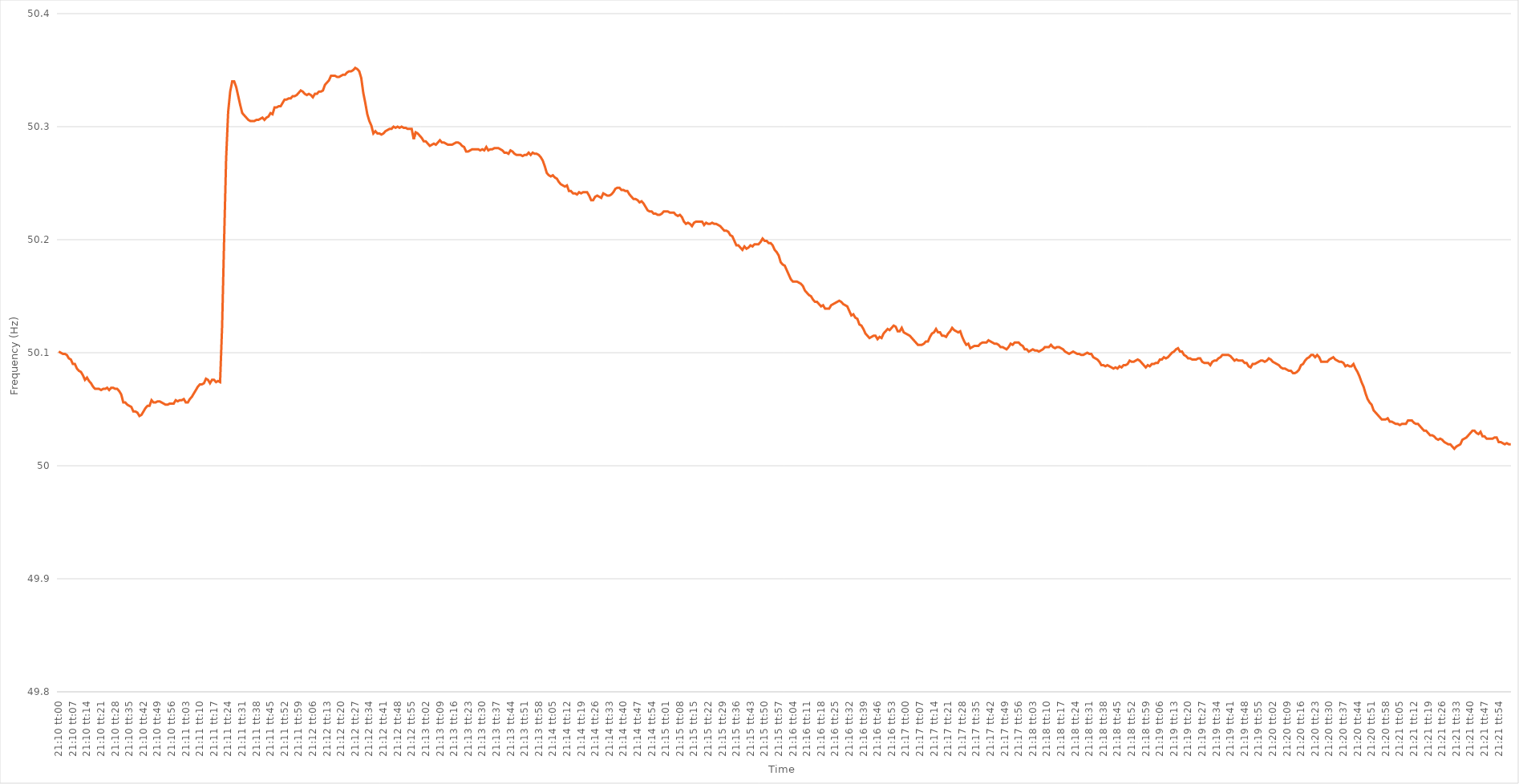
| Category | Series 0 |
|---|---|
| 0.8819444444444445 | 50.101 |
| 0.8819560185185185 | 50.1 |
| 0.8819675925925926 | 50.099 |
| 0.8819791666666666 | 50.099 |
| 0.8819907407407408 | 50.098 |
| 0.8820023148148147 | 50.095 |
| 0.8820138888888889 | 50.094 |
| 0.882025462962963 | 50.09 |
| 0.8820370370370371 | 50.09 |
| 0.8820486111111111 | 50.086 |
| 0.8820601851851851 | 50.084 |
| 0.8820717592592593 | 50.083 |
| 0.8820833333333334 | 50.08 |
| 0.8820949074074074 | 50.076 |
| 0.8821064814814815 | 50.078 |
| 0.8821180555555556 | 50.075 |
| 0.8821296296296296 | 50.073 |
| 0.8821412037037036 | 50.07 |
| 0.8821527777777778 | 50.068 |
| 0.8821643518518519 | 50.068 |
| 0.8821759259259259 | 50.068 |
| 0.8821875 | 50.067 |
| 0.882199074074074 | 50.068 |
| 0.8822106481481482 | 50.068 |
| 0.8822222222222221 | 50.069 |
| 0.8822337962962963 | 50.067 |
| 0.8822453703703704 | 50.069 |
| 0.8822569444444445 | 50.069 |
| 0.8822685185185185 | 50.068 |
| 0.8822800925925925 | 50.068 |
| 0.8822916666666667 | 50.066 |
| 0.8823032407407408 | 50.063 |
| 0.8823148148148148 | 50.056 |
| 0.8823263888888889 | 50.056 |
| 0.882337962962963 | 50.054 |
| 0.882349537037037 | 50.053 |
| 0.882361111111111 | 50.052 |
| 0.8823726851851852 | 50.048 |
| 0.8823842592592593 | 50.048 |
| 0.8823958333333333 | 50.047 |
| 0.8824074074074074 | 50.044 |
| 0.8824189814814815 | 50.045 |
| 0.8824305555555556 | 50.048 |
| 0.8824421296296295 | 50.051 |
| 0.8824537037037037 | 50.053 |
| 0.8824652777777778 | 50.053 |
| 0.8824768518518519 | 50.058 |
| 0.8824884259259259 | 50.056 |
| 0.8825 | 50.056 |
| 0.8825115740740741 | 50.057 |
| 0.8825231481481483 | 50.057 |
| 0.8825347222222222 | 50.056 |
| 0.8825462962962963 | 50.055 |
| 0.8825578703703704 | 50.054 |
| 0.8825694444444445 | 50.054 |
| 0.8825810185185184 | 50.055 |
| 0.8825925925925926 | 50.055 |
| 0.8826041666666667 | 50.055 |
| 0.8826157407407407 | 50.058 |
| 0.8826273148148148 | 50.057 |
| 0.8826388888888889 | 50.058 |
| 0.882650462962963 | 50.058 |
| 0.8826620370370369 | 50.059 |
| 0.8826736111111111 | 50.056 |
| 0.8826851851851852 | 50.056 |
| 0.8826967592592593 | 50.059 |
| 0.8827083333333333 | 50.061 |
| 0.8827199074074074 | 50.064 |
| 0.8827314814814815 | 50.067 |
| 0.8827430555555557 | 50.07 |
| 0.8827546296296296 | 50.072 |
| 0.8827662037037037 | 50.072 |
| 0.8827777777777778 | 50.073 |
| 0.8827893518518519 | 50.077 |
| 0.8828009259259259 | 50.076 |
| 0.8828125 | 50.073 |
| 0.8828240740740741 | 50.076 |
| 0.8828356481481481 | 50.076 |
| 0.8828472222222222 | 50.074 |
| 0.8828587962962963 | 50.075 |
| 0.8828703703703704 | 50.074 |
| 0.8828819444444443 | 50.123 |
| 0.8828935185185185 | 50.2 |
| 0.8829050925925926 | 50.272 |
| 0.8829166666666667 | 50.313 |
| 0.8829282407407407 | 50.331 |
| 0.8829398148148148 | 50.34 |
| 0.8829513888888889 | 50.34 |
| 0.8829629629629631 | 50.335 |
| 0.882974537037037 | 50.327 |
| 0.8829861111111111 | 50.319 |
| 0.8829976851851852 | 50.312 |
| 0.8830092592592593 | 50.31 |
| 0.8830208333333333 | 50.308 |
| 0.8830324074074074 | 50.306 |
| 0.8830439814814816 | 50.305 |
| 0.8830555555555555 | 50.305 |
| 0.8830671296296296 | 50.305 |
| 0.8830787037037037 | 50.306 |
| 0.8830902777777778 | 50.306 |
| 0.8831018518518517 | 50.307 |
| 0.8831134259259259 | 50.308 |
| 0.883125 | 50.306 |
| 0.8831365740740741 | 50.308 |
| 0.8831481481481481 | 50.309 |
| 0.8831597222222222 | 50.312 |
| 0.8831712962962963 | 50.311 |
| 0.8831828703703705 | 50.317 |
| 0.8831944444444444 | 50.317 |
| 0.8832060185185185 | 50.318 |
| 0.8832175925925926 | 50.318 |
| 0.8832291666666667 | 50.321 |
| 0.8832407407407407 | 50.324 |
| 0.8832523148148148 | 50.324 |
| 0.883263888888889 | 50.325 |
| 0.883275462962963 | 50.325 |
| 0.883287037037037 | 50.327 |
| 0.8832986111111111 | 50.327 |
| 0.8833101851851852 | 50.328 |
| 0.8833217592592592 | 50.33 |
| 0.8833333333333333 | 50.332 |
| 0.8833449074074075 | 50.331 |
| 0.8833564814814815 | 50.329 |
| 0.8833680555555555 | 50.328 |
| 0.8833796296296296 | 50.329 |
| 0.8833912037037037 | 50.328 |
| 0.8834027777777779 | 50.326 |
| 0.8834143518518518 | 50.329 |
| 0.883425925925926 | 50.329 |
| 0.8834375 | 50.331 |
| 0.8834490740740741 | 50.331 |
| 0.8834606481481481 | 50.332 |
| 0.8834722222222222 | 50.337 |
| 0.8834837962962964 | 50.339 |
| 0.8834953703703704 | 50.341 |
| 0.8835069444444444 | 50.345 |
| 0.8835185185185185 | 50.345 |
| 0.8835300925925926 | 50.345 |
| 0.8835416666666666 | 50.344 |
| 0.8835532407407407 | 50.344 |
| 0.8835648148148149 | 50.345 |
| 0.8835763888888889 | 50.346 |
| 0.8835879629629629 | 50.346 |
| 0.883599537037037 | 50.348 |
| 0.8836111111111111 | 50.349 |
| 0.8836226851851853 | 50.349 |
| 0.8836342592592592 | 50.35 |
| 0.8836458333333334 | 50.352 |
| 0.8836574074074074 | 50.351 |
| 0.8836689814814815 | 50.349 |
| 0.8836805555555555 | 50.343 |
| 0.8836921296296296 | 50.33 |
| 0.8837037037037038 | 50.321 |
| 0.8837152777777778 | 50.311 |
| 0.8837268518518518 | 50.305 |
| 0.8837384259259259 | 50.301 |
| 0.88375 | 50.294 |
| 0.883761574074074 | 50.296 |
| 0.8837731481481481 | 50.294 |
| 0.8837847222222223 | 50.294 |
| 0.8837962962962963 | 50.293 |
| 0.8838078703703703 | 50.294 |
| 0.8838194444444444 | 50.296 |
| 0.8838310185185185 | 50.297 |
| 0.8838425925925927 | 50.298 |
| 0.8838541666666666 | 50.298 |
| 0.8838657407407408 | 50.3 |
| 0.8838773148148148 | 50.299 |
| 0.883888888888889 | 50.3 |
| 0.8839004629629629 | 50.299 |
| 0.883912037037037 | 50.3 |
| 0.8839236111111112 | 50.299 |
| 0.8839351851851852 | 50.299 |
| 0.8839467592592593 | 50.298 |
| 0.8839583333333333 | 50.298 |
| 0.8839699074074074 | 50.298 |
| 0.8839814814814816 | 50.289 |
| 0.8839930555555555 | 50.295 |
| 0.8840046296296297 | 50.294 |
| 0.8840162037037037 | 50.292 |
| 0.8840277777777777 | 50.29 |
| 0.8840393518518518 | 50.287 |
| 0.8840509259259259 | 50.287 |
| 0.8840625000000001 | 50.285 |
| 0.884074074074074 | 50.283 |
| 0.8840856481481482 | 50.284 |
| 0.8840972222222222 | 50.285 |
| 0.8841087962962964 | 50.284 |
| 0.8841203703703703 | 50.286 |
| 0.8841319444444444 | 50.288 |
| 0.8841435185185186 | 50.286 |
| 0.8841550925925926 | 50.286 |
| 0.8841666666666667 | 50.285 |
| 0.8841782407407407 | 50.284 |
| 0.8841898148148148 | 50.284 |
| 0.884201388888889 | 50.284 |
| 0.8842129629629629 | 50.285 |
| 0.8842245370370371 | 50.286 |
| 0.8842361111111111 | 50.286 |
| 0.8842476851851852 | 50.285 |
| 0.8842592592592592 | 50.283 |
| 0.8842708333333333 | 50.282 |
| 0.8842824074074075 | 50.278 |
| 0.8842939814814814 | 50.278 |
| 0.8843055555555556 | 50.279 |
| 0.8843171296296296 | 50.28 |
| 0.8843287037037038 | 50.28 |
| 0.8843402777777777 | 50.28 |
| 0.8843518518518518 | 50.28 |
| 0.884363425925926 | 50.279 |
| 0.884375 | 50.28 |
| 0.8843865740740741 | 50.279 |
| 0.8843981481481481 | 50.282 |
| 0.8844097222222222 | 50.279 |
| 0.8844212962962964 | 50.28 |
| 0.8844328703703703 | 50.28 |
| 0.8844444444444445 | 50.281 |
| 0.8844560185185185 | 50.281 |
| 0.8844675925925927 | 50.281 |
| 0.8844791666666666 | 50.28 |
| 0.8844907407407407 | 50.279 |
| 0.8845023148148149 | 50.277 |
| 0.8845138888888888 | 50.277 |
| 0.884525462962963 | 50.276 |
| 0.884537037037037 | 50.279 |
| 0.8845486111111112 | 50.278 |
| 0.8845601851851851 | 50.276 |
| 0.8845717592592592 | 50.275 |
| 0.8845833333333334 | 50.275 |
| 0.8845949074074074 | 50.275 |
| 0.8846064814814815 | 50.274 |
| 0.8846180555555555 | 50.275 |
| 0.8846296296296297 | 50.275 |
| 0.8846412037037038 | 50.277 |
| 0.8846527777777777 | 50.275 |
| 0.8846643518518519 | 50.277 |
| 0.8846759259259259 | 50.276 |
| 0.8846875000000001 | 50.276 |
| 0.884699074074074 | 50.275 |
| 0.8847106481481481 | 50.273 |
| 0.8847222222222223 | 50.27 |
| 0.8847337962962962 | 50.265 |
| 0.8847453703703704 | 50.259 |
| 0.8847569444444444 | 50.257 |
| 0.8847685185185186 | 50.256 |
| 0.8847800925925925 | 50.257 |
| 0.8847916666666666 | 50.255 |
| 0.8848032407407408 | 50.254 |
| 0.8848148148148148 | 50.251 |
| 0.8848263888888889 | 50.249 |
| 0.8848379629629629 | 50.248 |
| 0.8848495370370371 | 50.247 |
| 0.8848611111111112 | 50.248 |
| 0.8848726851851851 | 50.243 |
| 0.8848842592592593 | 50.243 |
| 0.8848958333333333 | 50.241 |
| 0.8849074074074075 | 50.241 |
| 0.8849189814814814 | 50.24 |
| 0.8849305555555556 | 50.242 |
| 0.8849421296296297 | 50.241 |
| 0.8849537037037036 | 50.242 |
| 0.8849652777777778 | 50.242 |
| 0.8849768518518518 | 50.242 |
| 0.884988425925926 | 50.239 |
| 0.8849999999999999 | 50.235 |
| 0.885011574074074 | 50.235 |
| 0.8850231481481482 | 50.238 |
| 0.8850347222222222 | 50.239 |
| 0.8850462962962963 | 50.238 |
| 0.8850578703703703 | 50.237 |
| 0.8850694444444445 | 50.241 |
| 0.8850810185185186 | 50.24 |
| 0.8850925925925925 | 50.239 |
| 0.8851041666666667 | 50.239 |
| 0.8851157407407407 | 50.24 |
| 0.8851273148148149 | 50.242 |
| 0.8851388888888888 | 50.245 |
| 0.885150462962963 | 50.246 |
| 0.8851620370370371 | 50.246 |
| 0.8851736111111111 | 50.244 |
| 0.8851851851851852 | 50.244 |
| 0.8851967592592592 | 50.243 |
| 0.8852083333333334 | 50.243 |
| 0.8852199074074073 | 50.24 |
| 0.8852314814814815 | 50.238 |
| 0.8852430555555556 | 50.236 |
| 0.8852546296296296 | 50.236 |
| 0.8852662037037037 | 50.235 |
| 0.8852777777777777 | 50.233 |
| 0.8852893518518519 | 50.234 |
| 0.885300925925926 | 50.232 |
| 0.8853125 | 50.229 |
| 0.8853240740740741 | 50.226 |
| 0.8853356481481481 | 50.225 |
| 0.8853472222222223 | 50.225 |
| 0.8853587962962962 | 50.223 |
| 0.8853703703703704 | 50.223 |
| 0.8853819444444445 | 50.222 |
| 0.8853935185185186 | 50.222 |
| 0.8854050925925926 | 50.223 |
| 0.8854166666666666 | 50.225 |
| 0.8854282407407408 | 50.225 |
| 0.8854398148148147 | 50.225 |
| 0.8854513888888889 | 50.224 |
| 0.885462962962963 | 50.224 |
| 0.885474537037037 | 50.224 |
| 0.8854861111111111 | 50.222 |
| 0.8854976851851851 | 50.221 |
| 0.8855092592592593 | 50.222 |
| 0.8855208333333334 | 50.22 |
| 0.8855324074074074 | 50.216 |
| 0.8855439814814815 | 50.214 |
| 0.8855555555555555 | 50.215 |
| 0.8855671296296297 | 50.214 |
| 0.8855787037037036 | 50.212 |
| 0.8855902777777778 | 50.215 |
| 0.8856018518518519 | 50.216 |
| 0.885613425925926 | 50.216 |
| 0.885625 | 50.216 |
| 0.885636574074074 | 50.216 |
| 0.8856481481481482 | 50.213 |
| 0.8856597222222221 | 50.215 |
| 0.8856712962962963 | 50.214 |
| 0.8856828703703704 | 50.214 |
| 0.8856944444444445 | 50.215 |
| 0.8857060185185185 | 50.214 |
| 0.8857175925925925 | 50.214 |
| 0.8857291666666667 | 50.213 |
| 0.8857407407407408 | 50.212 |
| 0.8857523148148148 | 50.21 |
| 0.8857638888888889 | 50.208 |
| 0.885775462962963 | 50.208 |
| 0.8857870370370371 | 50.207 |
| 0.885798611111111 | 50.204 |
| 0.8858101851851852 | 50.203 |
| 0.8858217592592593 | 50.199 |
| 0.8858333333333334 | 50.195 |
| 0.8858449074074074 | 50.195 |
| 0.8858564814814814 | 50.193 |
| 0.8858680555555556 | 50.191 |
| 0.8858796296296297 | 50.194 |
| 0.8858912037037037 | 50.192 |
| 0.8859027777777778 | 50.193 |
| 0.8859143518518519 | 50.195 |
| 0.8859259259259259 | 50.194 |
| 0.8859374999999999 | 50.196 |
| 0.8859490740740741 | 50.196 |
| 0.8859606481481482 | 50.196 |
| 0.8859722222222222 | 50.198 |
| 0.8859837962962963 | 50.201 |
| 0.8859953703703703 | 50.199 |
| 0.8860069444444445 | 50.199 |
| 0.8860185185185184 | 50.197 |
| 0.8860300925925926 | 50.197 |
| 0.8860416666666667 | 50.195 |
| 0.8860532407407408 | 50.191 |
| 0.8860648148148148 | 50.189 |
| 0.8860763888888888 | 50.186 |
| 0.886087962962963 | 50.18 |
| 0.8860995370370371 | 50.178 |
| 0.8861111111111111 | 50.177 |
| 0.8861226851851852 | 50.173 |
| 0.8861342592592593 | 50.169 |
| 0.8861458333333333 | 50.165 |
| 0.8861574074074073 | 50.163 |
| 0.8861689814814815 | 50.163 |
| 0.8861805555555556 | 50.163 |
| 0.8861921296296296 | 50.162 |
| 0.8862037037037037 | 50.161 |
| 0.8862152777777778 | 50.159 |
| 0.8862268518518519 | 50.155 |
| 0.8862384259259258 | 50.153 |
| 0.88625 | 50.151 |
| 0.8862615740740741 | 50.15 |
| 0.8862731481481482 | 50.147 |
| 0.8862847222222222 | 50.145 |
| 0.8862962962962962 | 50.145 |
| 0.8863078703703704 | 50.143 |
| 0.8863194444444445 | 50.141 |
| 0.8863310185185185 | 50.142 |
| 0.8863425925925926 | 50.139 |
| 0.8863541666666667 | 50.139 |
| 0.8863657407407407 | 50.139 |
| 0.8863773148148147 | 50.142 |
| 0.8863888888888889 | 50.143 |
| 0.886400462962963 | 50.144 |
| 0.886412037037037 | 50.145 |
| 0.8864236111111111 | 50.146 |
| 0.8864351851851852 | 50.145 |
| 0.8864467592592593 | 50.143 |
| 0.8864583333333332 | 50.142 |
| 0.8864699074074074 | 50.141 |
| 0.8864814814814815 | 50.137 |
| 0.8864930555555556 | 50.133 |
| 0.8865046296296296 | 50.134 |
| 0.8865162037037037 | 50.131 |
| 0.8865277777777778 | 50.13 |
| 0.886539351851852 | 50.125 |
| 0.8865509259259259 | 50.124 |
| 0.8865625 | 50.121 |
| 0.8865740740740741 | 50.117 |
| 0.8865856481481482 | 50.115 |
| 0.8865972222222221 | 50.113 |
| 0.8866087962962963 | 50.114 |
| 0.8866203703703704 | 50.115 |
| 0.8866319444444444 | 50.115 |
| 0.8866435185185185 | 50.112 |
| 0.8866550925925926 | 50.114 |
| 0.8866666666666667 | 50.113 |
| 0.8866782407407406 | 50.117 |
| 0.8866898148148148 | 50.119 |
| 0.8867013888888889 | 50.121 |
| 0.886712962962963 | 50.12 |
| 0.886724537037037 | 50.122 |
| 0.8867361111111111 | 50.124 |
| 0.8867476851851852 | 50.123 |
| 0.8867592592592594 | 50.119 |
| 0.8867708333333333 | 50.119 |
| 0.8867824074074074 | 50.122 |
| 0.8867939814814815 | 50.118 |
| 0.8868055555555556 | 50.117 |
| 0.8868171296296296 | 50.116 |
| 0.8868287037037037 | 50.115 |
| 0.8868402777777779 | 50.113 |
| 0.8868518518518518 | 50.111 |
| 0.8868634259259259 | 50.109 |
| 0.886875 | 50.107 |
| 0.8868865740740741 | 50.107 |
| 0.886898148148148 | 50.107 |
| 0.8869097222222222 | 50.108 |
| 0.8869212962962963 | 50.11 |
| 0.8869328703703704 | 50.11 |
| 0.8869444444444444 | 50.114 |
| 0.8869560185185185 | 50.117 |
| 0.8869675925925926 | 50.118 |
| 0.8869791666666668 | 50.121 |
| 0.8869907407407407 | 50.118 |
| 0.8870023148148148 | 50.118 |
| 0.8870138888888889 | 50.115 |
| 0.887025462962963 | 50.115 |
| 0.887037037037037 | 50.114 |
| 0.8870486111111111 | 50.117 |
| 0.8870601851851853 | 50.119 |
| 0.8870717592592593 | 50.122 |
| 0.8870833333333333 | 50.12 |
| 0.8870949074074074 | 50.119 |
| 0.8871064814814815 | 50.118 |
| 0.8871180555555555 | 50.119 |
| 0.8871296296296296 | 50.114 |
| 0.8871412037037038 | 50.11 |
| 0.8871527777777778 | 50.107 |
| 0.8871643518518518 | 50.108 |
| 0.8871759259259259 | 50.104 |
| 0.8871875 | 50.105 |
| 0.8871990740740742 | 50.106 |
| 0.8872106481481481 | 50.106 |
| 0.8872222222222222 | 50.106 |
| 0.8872337962962963 | 50.108 |
| 0.8872453703703704 | 50.109 |
| 0.8872569444444444 | 50.109 |
| 0.8872685185185185 | 50.109 |
| 0.8872800925925927 | 50.111 |
| 0.8872916666666667 | 50.11 |
| 0.8873032407407407 | 50.109 |
| 0.8873148148148148 | 50.108 |
| 0.8873263888888889 | 50.108 |
| 0.8873379629629629 | 50.107 |
| 0.887349537037037 | 50.105 |
| 0.8873611111111112 | 50.105 |
| 0.8873726851851852 | 50.104 |
| 0.8873842592592592 | 50.103 |
| 0.8873958333333333 | 50.105 |
| 0.8874074074074074 | 50.108 |
| 0.8874189814814816 | 50.107 |
| 0.8874305555555555 | 50.109 |
| 0.8874421296296297 | 50.109 |
| 0.8874537037037037 | 50.109 |
| 0.8874652777777778 | 50.107 |
| 0.8874768518518518 | 50.106 |
| 0.8874884259259259 | 50.103 |
| 0.8875000000000001 | 50.103 |
| 0.8875115740740741 | 50.101 |
| 0.8875231481481481 | 50.102 |
| 0.8875347222222222 | 50.103 |
| 0.8875462962962963 | 50.102 |
| 0.8875578703703703 | 50.102 |
| 0.8875694444444444 | 50.101 |
| 0.8875810185185186 | 50.102 |
| 0.8875925925925926 | 50.103 |
| 0.8876041666666666 | 50.105 |
| 0.8876157407407407 | 50.105 |
| 0.8876273148148148 | 50.105 |
| 0.887638888888889 | 50.107 |
| 0.8876504629629629 | 50.105 |
| 0.887662037037037 | 50.104 |
| 0.8876736111111111 | 50.105 |
| 0.8876851851851852 | 50.105 |
| 0.8876967592592592 | 50.104 |
| 0.8877083333333333 | 50.103 |
| 0.8877199074074075 | 50.101 |
| 0.8877314814814815 | 50.1 |
| 0.8877430555555555 | 50.099 |
| 0.8877546296296296 | 50.1 |
| 0.8877662037037037 | 50.101 |
| 0.8877777777777777 | 50.1 |
| 0.8877893518518518 | 50.099 |
| 0.887800925925926 | 50.099 |
| 0.8878125 | 50.098 |
| 0.887824074074074 | 50.098 |
| 0.8878356481481481 | 50.099 |
| 0.8878472222222222 | 50.1 |
| 0.8878587962962964 | 50.099 |
| 0.8878703703703703 | 50.099 |
| 0.8878819444444445 | 50.096 |
| 0.8878935185185185 | 50.095 |
| 0.8879050925925926 | 50.094 |
| 0.8879166666666666 | 50.092 |
| 0.8879282407407407 | 50.089 |
| 0.8879398148148149 | 50.089 |
| 0.8879513888888889 | 50.088 |
| 0.887962962962963 | 50.089 |
| 0.887974537037037 | 50.088 |
| 0.8879861111111111 | 50.087 |
| 0.8879976851851853 | 50.086 |
| 0.8880092592592592 | 50.087 |
| 0.8880208333333334 | 50.086 |
| 0.8880324074074074 | 50.088 |
| 0.8880439814814814 | 50.087 |
| 0.8880555555555555 | 50.089 |
| 0.8880671296296296 | 50.089 |
| 0.8880787037037038 | 50.09 |
| 0.8880902777777777 | 50.093 |
| 0.8881018518518519 | 50.092 |
| 0.8881134259259259 | 50.092 |
| 0.888125 | 50.093 |
| 0.888136574074074 | 50.094 |
| 0.8881481481481481 | 50.093 |
| 0.8881597222222223 | 50.091 |
| 0.8881712962962963 | 50.089 |
| 0.8881828703703704 | 50.087 |
| 0.8881944444444444 | 50.089 |
| 0.8882060185185185 | 50.088 |
| 0.8882175925925927 | 50.09 |
| 0.8882291666666666 | 50.09 |
| 0.8882407407407408 | 50.091 |
| 0.8882523148148148 | 50.091 |
| 0.888263888888889 | 50.094 |
| 0.8882754629629629 | 50.094 |
| 0.888287037037037 | 50.096 |
| 0.8882986111111112 | 50.095 |
| 0.8883101851851851 | 50.096 |
| 0.8883217592592593 | 50.098 |
| 0.8883333333333333 | 50.1 |
| 0.8883449074074075 | 50.101 |
| 0.8883564814814814 | 50.103 |
| 0.8883680555555555 | 50.104 |
| 0.8883796296296297 | 50.101 |
| 0.8883912037037037 | 50.101 |
| 0.8884027777777778 | 50.098 |
| 0.8884143518518518 | 50.097 |
| 0.888425925925926 | 50.095 |
| 0.8884375000000001 | 50.095 |
| 0.888449074074074 | 50.094 |
| 0.8884606481481482 | 50.094 |
| 0.8884722222222222 | 50.094 |
| 0.8884837962962964 | 50.095 |
| 0.8884953703703703 | 50.095 |
| 0.8885069444444444 | 50.092 |
| 0.8885185185185186 | 50.091 |
| 0.8885300925925925 | 50.091 |
| 0.8885416666666667 | 50.091 |
| 0.8885532407407407 | 50.089 |
| 0.8885648148148149 | 50.092 |
| 0.8885763888888888 | 50.093 |
| 0.8885879629629629 | 50.093 |
| 0.8885995370370371 | 50.095 |
| 0.8886111111111111 | 50.096 |
| 0.8886226851851852 | 50.098 |
| 0.8886342592592592 | 50.098 |
| 0.8886458333333334 | 50.098 |
| 0.8886574074074075 | 50.098 |
| 0.8886689814814814 | 50.097 |
| 0.8886805555555556 | 50.095 |
| 0.8886921296296296 | 50.093 |
| 0.8887037037037038 | 50.094 |
| 0.8887152777777777 | 50.093 |
| 0.8887268518518519 | 50.093 |
| 0.888738425925926 | 50.093 |
| 0.8887499999999999 | 50.091 |
| 0.8887615740740741 | 50.091 |
| 0.8887731481481481 | 50.088 |
| 0.8887847222222223 | 50.087 |
| 0.8887962962962962 | 50.09 |
| 0.8888078703703703 | 50.09 |
| 0.8888194444444445 | 50.091 |
| 0.8888310185185185 | 50.092 |
| 0.8888425925925926 | 50.093 |
| 0.8888541666666666 | 50.093 |
| 0.8888657407407408 | 50.092 |
| 0.8888773148148149 | 50.093 |
| 0.8888888888888888 | 50.095 |
| 0.888900462962963 | 50.094 |
| 0.888912037037037 | 50.092 |
| 0.8889236111111112 | 50.091 |
| 0.8889351851851851 | 50.09 |
| 0.8889467592592593 | 50.089 |
| 0.8889583333333334 | 50.087 |
| 0.8889699074074073 | 50.086 |
| 0.8889814814814815 | 50.086 |
| 0.8889930555555555 | 50.085 |
| 0.8890046296296297 | 50.084 |
| 0.8890162037037036 | 50.084 |
| 0.8890277777777778 | 50.082 |
| 0.8890393518518519 | 50.082 |
| 0.8890509259259259 | 50.083 |
| 0.8890625 | 50.085 |
| 0.889074074074074 | 50.089 |
| 0.8890856481481482 | 50.09 |
| 0.8890972222222223 | 50.093 |
| 0.8891087962962962 | 50.095 |
| 0.8891203703703704 | 50.096 |
| 0.8891319444444444 | 50.098 |
| 0.8891435185185186 | 50.098 |
| 0.8891550925925925 | 50.096 |
| 0.8891666666666667 | 50.098 |
| 0.8891782407407408 | 50.096 |
| 0.8891898148148148 | 50.092 |
| 0.8892013888888889 | 50.092 |
| 0.8892129629629629 | 50.092 |
| 0.8892245370370371 | 50.092 |
| 0.889236111111111 | 50.094 |
| 0.8892476851851852 | 50.095 |
| 0.8892592592592593 | 50.096 |
| 0.8892708333333333 | 50.094 |
| 0.8892824074074074 | 50.093 |
| 0.8892939814814814 | 50.092 |
| 0.8893055555555556 | 50.092 |
| 0.8893171296296297 | 50.091 |
| 0.8893287037037036 | 50.088 |
| 0.8893402777777778 | 50.089 |
| 0.8893518518518518 | 50.088 |
| 0.889363425925926 | 50.088 |
| 0.8893749999999999 | 50.09 |
| 0.8893865740740741 | 50.086 |
| 0.8893981481481482 | 50.083 |
| 0.8894097222222223 | 50.079 |
| 0.8894212962962963 | 50.074 |
| 0.8894328703703703 | 50.07 |
| 0.8894444444444445 | 50.064 |
| 0.8894560185185184 | 50.059 |
| 0.8894675925925926 | 50.056 |
| 0.8894791666666667 | 50.054 |
| 0.8894907407407407 | 50.049 |
| 0.8895023148148148 | 50.047 |
| 0.8895138888888888 | 50.045 |
| 0.889525462962963 | 50.043 |
| 0.8895370370370371 | 50.041 |
| 0.889548611111111 | 50.041 |
| 0.8895601851851852 | 50.041 |
| 0.8895717592592592 | 50.042 |
| 0.8895833333333334 | 50.039 |
| 0.8895949074074073 | 50.039 |
| 0.8896064814814815 | 50.038 |
| 0.8896180555555556 | 50.037 |
| 0.8896296296296297 | 50.037 |
| 0.8896412037037037 | 50.036 |
| 0.8896527777777777 | 50.037 |
| 0.8896643518518519 | 50.037 |
| 0.889675925925926 | 50.037 |
| 0.8896875 | 50.04 |
| 0.8896990740740741 | 50.04 |
| 0.8897106481481482 | 50.04 |
| 0.8897222222222222 | 50.038 |
| 0.8897337962962962 | 50.037 |
| 0.8897453703703704 | 50.037 |
| 0.8897569444444445 | 50.035 |
| 0.8897685185185185 | 50.033 |
| 0.8897800925925926 | 50.031 |
| 0.8897916666666666 | 50.031 |
| 0.8898032407407408 | 50.029 |
| 0.8898148148148147 | 50.027 |
| 0.8898263888888889 | 50.027 |
| 0.889837962962963 | 50.026 |
| 0.8898495370370371 | 50.024 |
| 0.8898611111111111 | 50.023 |
| 0.8898726851851851 | 50.024 |
| 0.8898842592592593 | 50.023 |
| 0.8898958333333334 | 50.021 |
| 0.8899074074074074 | 50.02 |
| 0.8899189814814815 | 50.019 |
| 0.8899305555555556 | 50.019 |
| 0.8899421296296296 | 50.017 |
| 0.8899537037037036 | 50.015 |
| 0.8899652777777778 | 50.017 |
| 0.8899768518518519 | 50.018 |
| 0.8899884259259259 | 50.019 |
| 0.89 | 50.023 |
| 0.890011574074074 | 50.024 |
| 0.8900231481481482 | 50.025 |
| 0.8900347222222221 | 50.027 |
| 0.8900462962962963 | 50.029 |
| 0.8900578703703704 | 50.031 |
| 0.8900694444444445 | 50.031 |
| 0.8900810185185185 | 50.029 |
| 0.8900925925925925 | 50.028 |
| 0.8901041666666667 | 50.03 |
| 0.8901157407407408 | 50.026 |
| 0.8901273148148148 | 50.026 |
| 0.8901388888888889 | 50.024 |
| 0.890150462962963 | 50.024 |
| 0.890162037037037 | 50.024 |
| 0.890173611111111 | 50.024 |
| 0.8901851851851852 | 50.025 |
| 0.8901967592592593 | 50.025 |
| 0.8902083333333333 | 50.021 |
| 0.8902199074074074 | 50.021 |
| 0.8902314814814815 | 50.02 |
| 0.8902430555555556 | 50.019 |
| 0.8902546296296295 | 50.02 |
| 0.8902662037037037 | 50.019 |
| 0.8902777777777778 | 50.019 |